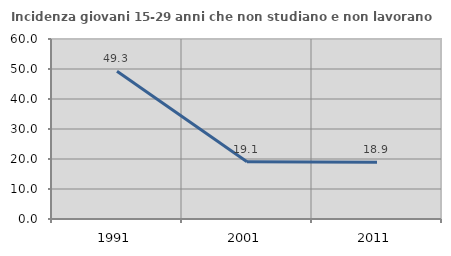
| Category | Incidenza giovani 15-29 anni che non studiano e non lavorano  |
|---|---|
| 1991.0 | 49.281 |
| 2001.0 | 19.077 |
| 2011.0 | 18.915 |